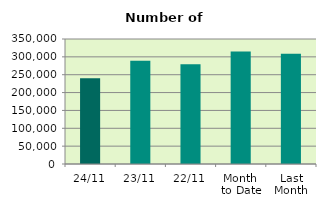
| Category | Series 0 |
|---|---|
| 24/11 | 240408 |
| 23/11 | 288816 |
| 22/11 | 279084 |
| Month 
to Date | 314661.667 |
| Last
Month | 308508.19 |